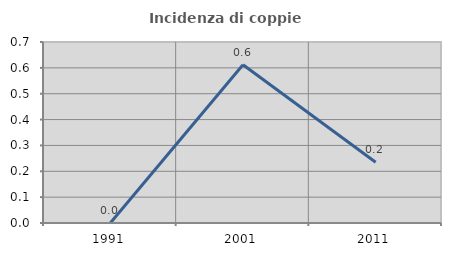
| Category | Incidenza di coppie miste |
|---|---|
| 1991.0 | 0 |
| 2001.0 | 0.612 |
| 2011.0 | 0.235 |